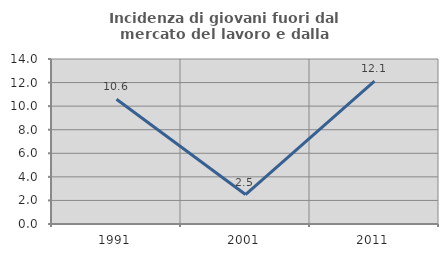
| Category | Incidenza di giovani fuori dal mercato del lavoro e dalla formazione  |
|---|---|
| 1991.0 | 10.588 |
| 2001.0 | 2.5 |
| 2011.0 | 12.121 |